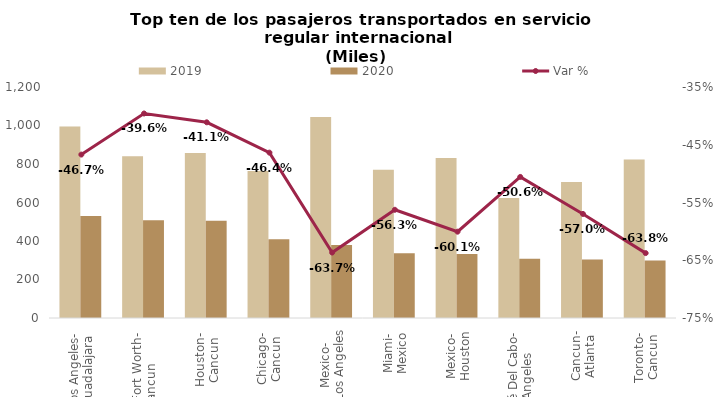
| Category | 2019 | 2020 |
|---|---|---|
| Los Angeles-
Guadalajara | 994.822 | 530.232 |
| Dallas/Fort Worth-
Cancun | 840.8 | 507.946 |
| Houston-
Cancun | 856.952 | 504.622 |
| Chicago-
Cancun | 763.83 | 409.671 |
| Mexico-
Los Angeles | 1044.786 | 379.603 |
| Miami-
Mexico | 770.177 | 336.869 |
| Mexico-
Houston | 831.729 | 332.243 |
| San José Del Cabo-
Los Angeles | 623.855 | 308.366 |
| Cancun-
Atlanta | 706.409 | 303.913 |
| Toronto-
Cancun | 822.744 | 298.135 |